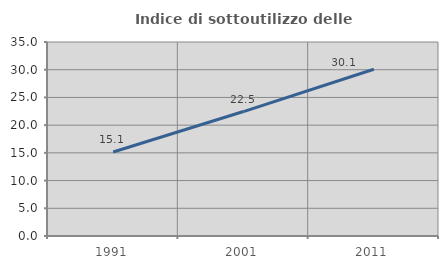
| Category | Indice di sottoutilizzo delle abitazioni  |
|---|---|
| 1991.0 | 15.148 |
| 2001.0 | 22.452 |
| 2011.0 | 30.081 |